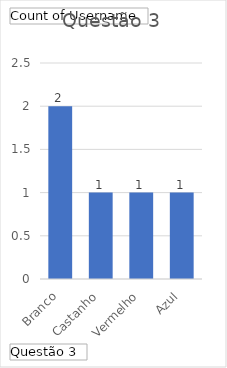
| Category | Total |
|---|---|
| Branco | 2 |
| Castanho | 1 |
| Vermelho | 1 |
| Azul | 1 |